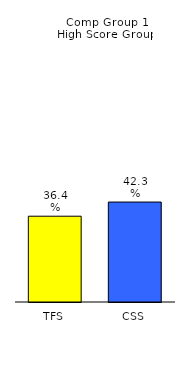
| Category | Series 0 |
|---|---|
| TFS | 0.364 |
| CSS | 0.423 |